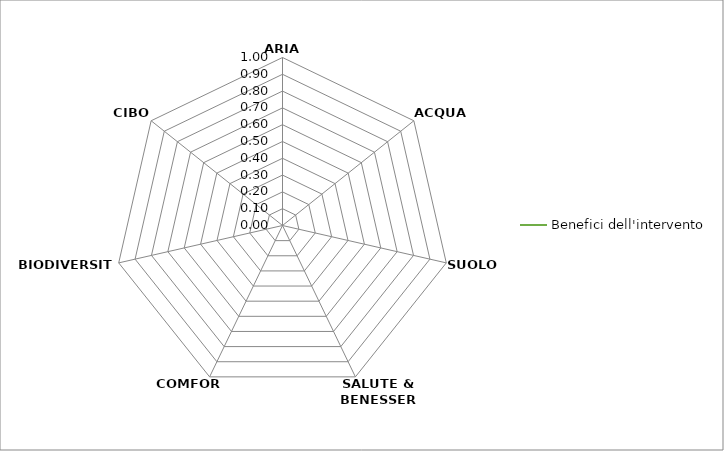
| Category | Benefici dell'intervento |
|---|---|
| ARIA | 0 |
| ACQUA | 0 |
| SUOLO | 0 |
| SALUTE & BENESSERE | 0 |
| COMFORT | 0 |
| BIODIVERSITA' | 0 |
| CIBO | 0 |